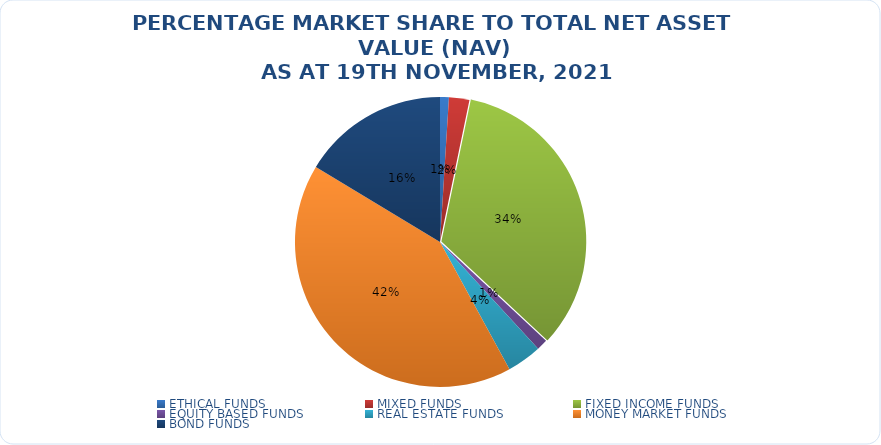
| Category | NET ASSET VALUE |
|---|---|
| ETHICAL FUNDS | 12778767670.14 |
| MIXED FUNDS | 29370374411.096 |
| FIXED INCOME FUNDS | 435854035121.266 |
| EQUITY BASED FUNDS | 15965047161.14 |
| REAL ESTATE FUNDS | 50153494933.33 |
| MONEY MARKET FUNDS | 538215247916.044 |
| BOND FUNDS | 211635616113.149 |